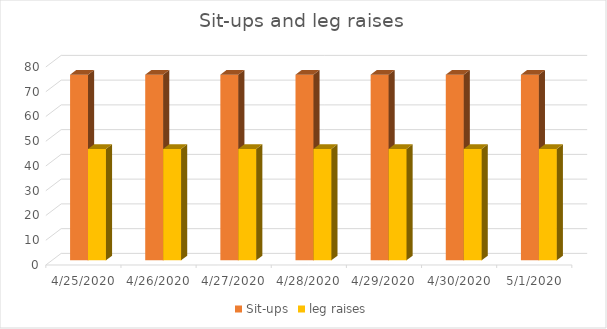
| Category | Sit-ups | leg raises |
|---|---|---|
| 4/25/20 | 75 | 45 |
| 4/26/20 | 75 | 45 |
| 4/27/20 | 75 | 45 |
| 4/28/20 | 75 | 45 |
| 4/29/20 | 75 | 45 |
| 4/30/20 | 75 | 45 |
| 5/1/20 | 75 | 45 |